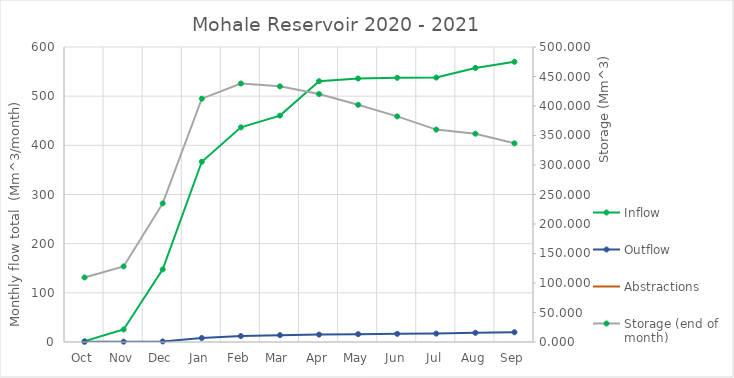
| Category | Inflow | Outflow |
|---|---|---|
| Oct | 1.621 | 0.333 |
| Nov | 25.455 | 0.681 |
| Dec | 147.681 | 1.136 |
| Jan | 366.642 | 8.08 |
| Feb | 436.625 | 12.041 |
| Mar | 460.494 | 13.967 |
| Apr | 530.477 | 15.114 |
| May | 535.936 | 15.954 |
| Jun | 537.354 | 16.546 |
| Jul | 537.893 | 17.122 |
| Aug | 557.47 | 18.678 |
| Sep | 569.911 | 19.791 |